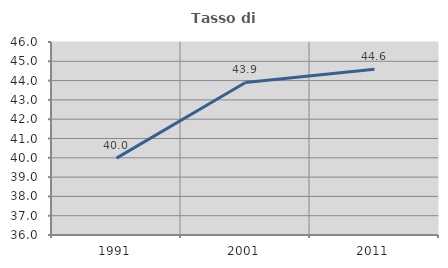
| Category | Tasso di occupazione   |
|---|---|
| 1991.0 | 39.981 |
| 2001.0 | 43.905 |
| 2011.0 | 44.583 |